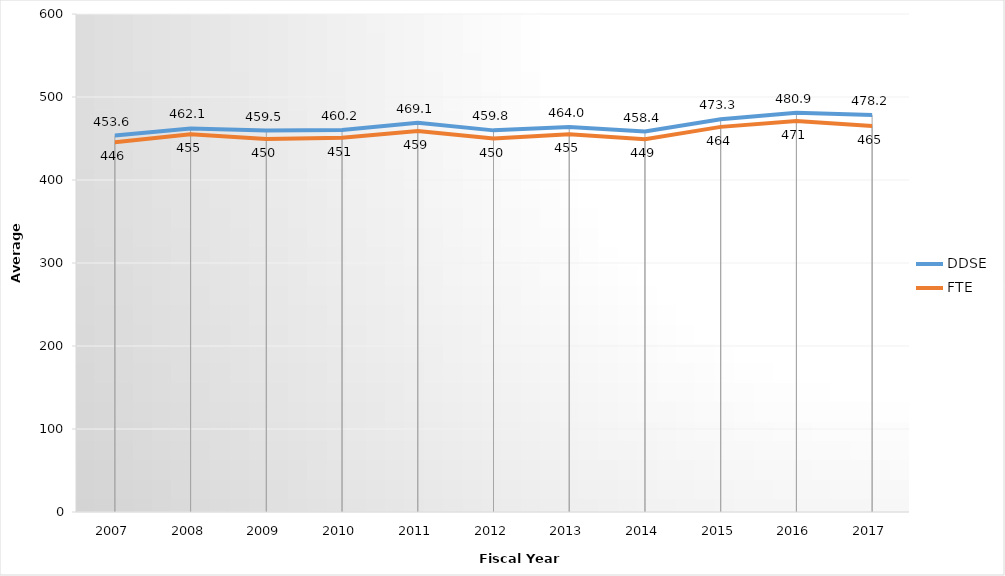
| Category | DDSE | FTE |
|---|---|---|
| 2007.0 | 453.6 | 445.6 |
| 2008.0 | 462.1 | 455 |
| 2009.0 | 459.5 | 449.5 |
| 2010.0 | 460.2 | 451 |
| 2011.0 | 469.1 | 459 |
| 2012.0 | 459.8 | 450 |
| 2013.0 | 464 | 455 |
| 2014.0 | 458.4 | 449 |
| 2015.0 | 473.3 | 464 |
| 2016.0 | 480.9 | 471 |
| 2017.0 | 478.2 | 465 |